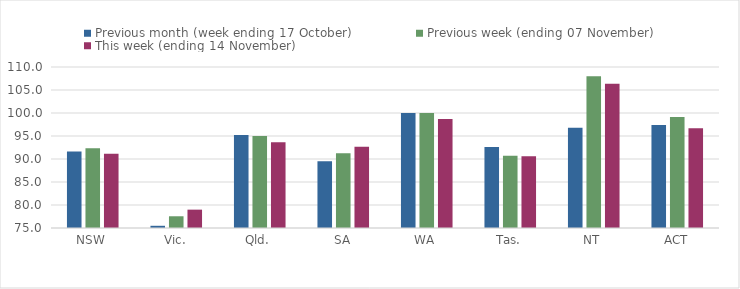
| Category | Previous month (week ending 17 October) | Previous week (ending 07 November) | This week (ending 14 November) |
|---|---|---|---|
| NSW | 91.61 | 92.36 | 91.12 |
| Vic. | 75.48 | 77.55 | 78.99 |
| Qld. | 95.23 | 95.01 | 93.64 |
| SA | 89.52 | 91.25 | 92.68 |
| WA | 99.99 | 100 | 98.69 |
| Tas. | 92.63 | 90.71 | 90.62 |
| NT | 96.77 | 107.98 | 106.36 |
| ACT | 97.39 | 99.11 | 96.67 |